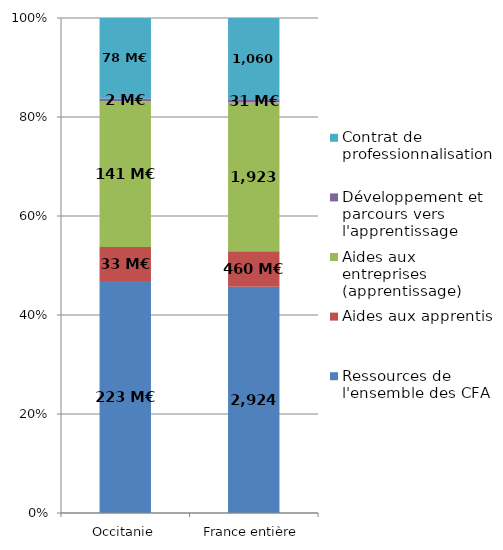
| Category | Ressources de l'ensemble des CFA | Aides aux apprentis | Aides aux entreprises (apprentissage) | Développement et parcours vers l'apprentissage | Contrat de professionnalisation |
|---|---|---|---|---|---|
| Occitanie | 223.459 | 32.708 | 140.588 | 2.493 | 77.663 |
| France entière | 2924.219 | 459.796 | 1923.184 | 31.421 | 1060.48 |